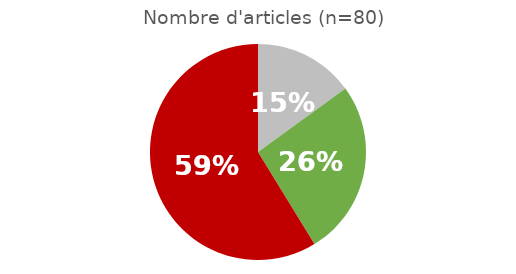
| Category | Series 0 |
|---|---|
| 0 | 0.15 |
| 1 | 0.262 |
| 2 | 0.588 |